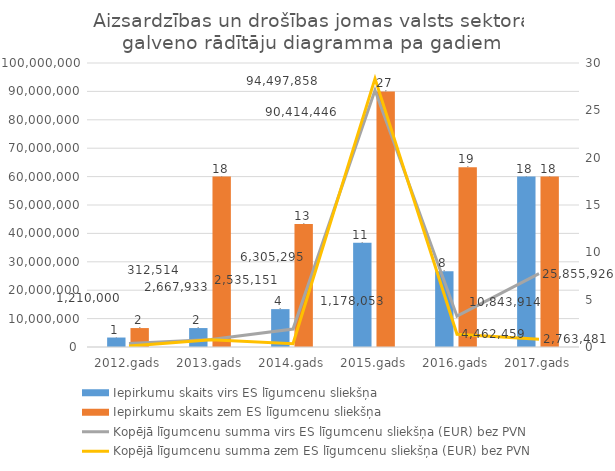
| Category | Iepirkumu skaits virs ES līgumcenu sliekšņa | Iepirkumu skaits zem ES līgumcenu sliekšņa |
|---|---|---|
| 2012.gads | 1 | 2 |
| 2013.gads | 2 | 18 |
| 2014.gads | 4 | 13 |
| 2015.gads | 11 | 27 |
| 2016.gads | 8 | 19 |
| 2017.gads | 18 | 18 |